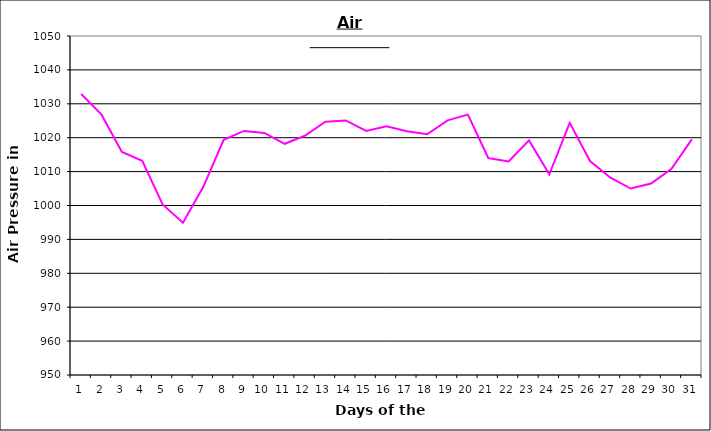
| Category | Series 0 |
|---|---|
| 0 | 1032.9 |
| 1 | 1026.8 |
| 2 | 1015.8 |
| 3 | 1013.2 |
| 4 | 1000.3 |
| 5 | 994.9 |
| 6 | 1005.5 |
| 7 | 1019.4 |
| 8 | 1022 |
| 9 | 1021.4 |
| 10 | 1018.2 |
| 11 | 1020.6 |
| 12 | 1024.7 |
| 13 | 1025.1 |
| 14 | 1022 |
| 15 | 1023.4 |
| 16 | 1021.9 |
| 17 | 1021 |
| 18 | 1025.1 |
| 19 | 1026.8 |
| 20 | 1014 |
| 21 | 1013 |
| 22 | 1019.2 |
| 23 | 1009.2 |
| 24 | 1024.4 |
| 25 | 1013.1 |
| 26 | 1008.2 |
| 27 | 1005 |
| 28 | 1006.5 |
| 29 | 1010.8 |
| 30 | 1019.5 |